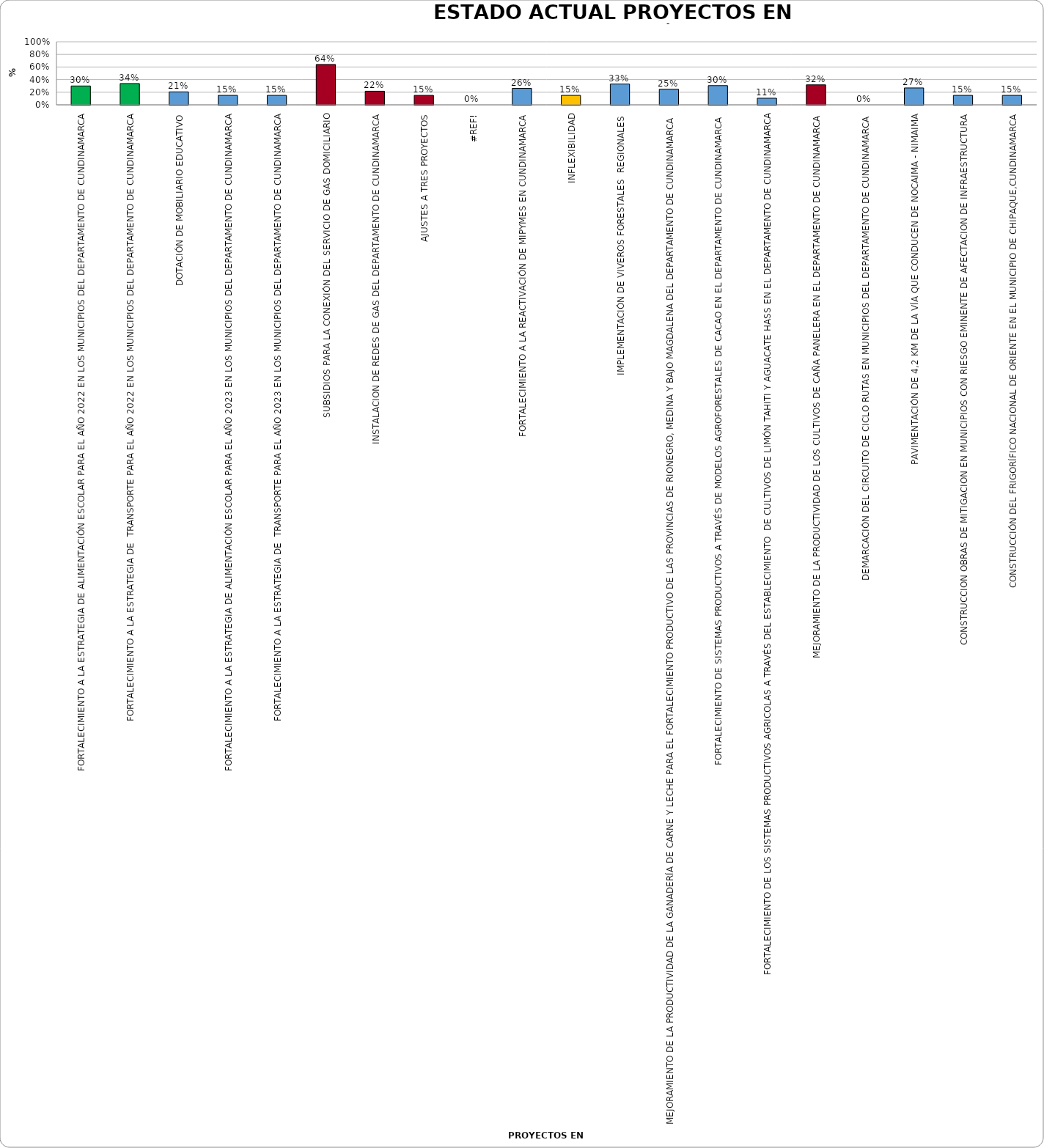
| Category | % AVANCE |
|---|---|
| FORTALECIMIENTO A LA ESTRATEGIA DE ALIMENTACIÓN ESCOLAR PARA EL AÑO 2022 EN LOS MUNICIPIOS DEL DEPARTAMENTO DE CUNDINAMARCA | 0.299 |
| FORTALECIMIENTO A LA ESTRATEGIA DE  TRANSPORTE PARA EL AÑO 2022 EN LOS MUNICIPIOS DEL DEPARTAMENTO DE CUNDINAMARCA | 0.338 |
| DOTACIÓN DE MOBILIARIO EDUCATIVO | 0.206 |
| FORTALECIMIENTO A LA ESTRATEGIA DE ALIMENTACIÓN ESCOLAR PARA EL AÑO 2023 EN LOS MUNICIPIOS DEL DEPARTAMENTO DE CUNDINAMARCA | 0.15 |
| FORTALECIMIENTO A LA ESTRATEGIA DE  TRANSPORTE PARA EL AÑO 2023 EN LOS MUNICIPIOS DEL DEPARTAMENTO DE CUNDINAMARCA | 0.15 |
| SUBSIDIOS PARA LA CONEXIÓN DEL SERVICIO DE GAS DOMICILIARIO | 0.641 |
| INSTALACION DE REDES DE GAS DEL DEPARTAMENTO DE CUNDINAMARCA | 0.216 |
| AJUSTES A TRES PROYECTOS | 0.15 |
| #¡REF! | 0 |
| FORTALECIMIENTO A LA REACTIVACIÓN DE MIPYMES EN CUNDINAMARCA | 0.261 |
| INFLEXIBILIDAD | 0.15 |
| IMPLEMENTACIÓN DE VIVEROS FORESTALES  REGIONALES  | 0.33 |
| MEJORAMIENTO DE LA PRODUCTIVIDAD DE LA GANADERÍA DE CARNE Y LECHE PARA EL FORTALECIMIENTO PRODUCTIVO DE LAS PROVINCIAS DE RIONEGRO, MEDINA Y BAJO MAGDALENA DEL DEPARTAMENTO DE CUNDINAMARCA | 0.248 |
| FORTALECIMIENTO DE SISTEMAS PRODUCTIVOS A TRAVÉS DE MODELOS AGROFORESTALES DE CACAO EN EL DEPARTAMENTO DE CUNDINAMARCA
 | 0.305 |
| FORTALECIMIENTO DE LOS SISTEMAS PRODUCTIVOS AGRICOLAS A TRAVÉS DEL ESTABLECIMIENTO  DE CULTIVOS DE LIMÓN TAHITI Y AGUACATE HASS EN EL DEPARTAMENTO DE CUNDINAMARCA | 0.105 |
| MEJORAMIENTO DE LA PRODUCTIVIDAD DE LOS CULTIVOS DE CAÑA PANELERA EN EL DEPARTAMENTO DE CUNDINAMARCA | 0.317 |
| DEMARCACIÓN DEL CIRCUITO DE CICLO RUTAS EN MUNICIPIOS DEL DEPARTAMENTO DE CUNDINAMARCA | 0 |
| PAVIMENTACIÓN DE 4,2 KM DE LA VÍA QUE CONDUCEN DE NOCAIMA - NIMAIMA | 0.268 |
| CONSTRUCCION OBRAS DE MITIGACION EN MUNICIPIOS CON RIESGO EMINENTE DE AFECTACION DE INFRAESTRUCTURA | 0.15 |
| CONSTRUCCIÓN DEL FRIGORÍFICO NACIONAL DE ORIENTE EN EL MUNICIPIO DE CHIPAQUE,CUNDINAMARCA | 0.15 |